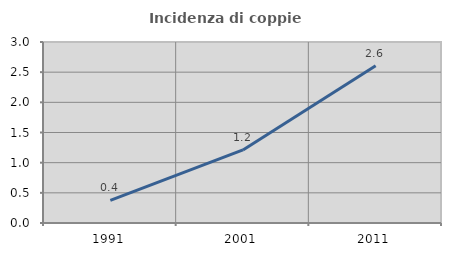
| Category | Incidenza di coppie miste |
|---|---|
| 1991.0 | 0.374 |
| 2001.0 | 1.211 |
| 2011.0 | 2.608 |